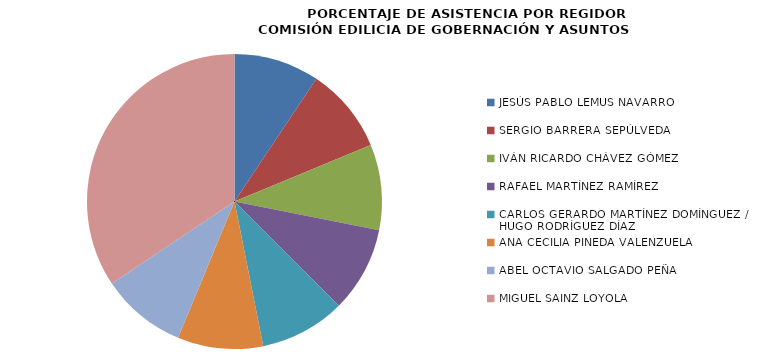
| Category | Series 0 |
|---|---|
| JESÚS PABLO LEMUS NAVARRO | 100 |
| SERGIO BARRERA SEPÚLVEDA | 100 |
| IVÁN RICARDO CHÁVEZ GÓMEZ | 100 |
| RAFAEL MARTÍNEZ RAMÍREZ | 100 |
| CARLOS GERARDO MARTÍNEZ DOMÍNGUEZ /
HUGO RODRÍGUEZ DÍAZ | 100 |
| ANA CECILIA PINEDA VALENZUELA | 100 |
| ABEL OCTAVIO SALGADO PEÑA | 100 |
| MIGUEL SAINZ LOYOLA | 366.667 |